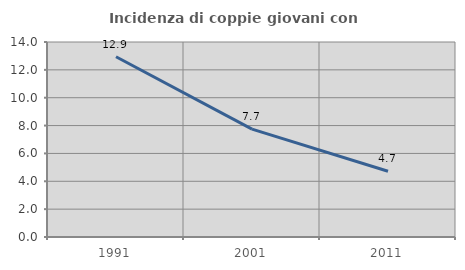
| Category | Incidenza di coppie giovani con figli |
|---|---|
| 1991.0 | 12.944 |
| 2001.0 | 7.746 |
| 2011.0 | 4.721 |